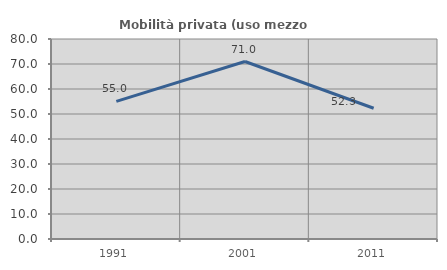
| Category | Mobilità privata (uso mezzo privato) |
|---|---|
| 1991.0 | 55.039 |
| 2001.0 | 71 |
| 2011.0 | 52.308 |